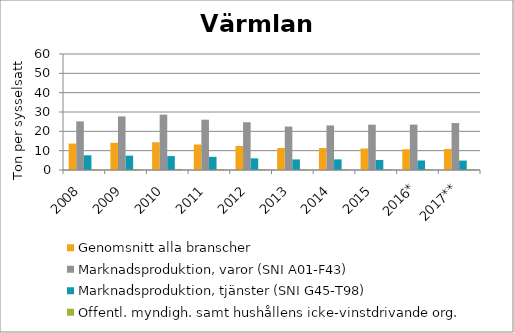
| Category | Genomsnitt alla branscher | Marknadsproduktion, varor (SNI A01-F43) | Marknadsproduktion, tjänster (SNI G45-T98) | Offentl. myndigh. samt hushållens icke-vinstdrivande org. |
|---|---|---|---|---|
| 2008 | 13.674 | 25.14 | 7.613 | 0.503 |
| 2009 | 14.056 | 27.711 | 7.437 | 0.516 |
| 2010 | 14.359 | 28.622 | 7.215 | 0.543 |
| 2011 | 13.195 | 26.022 | 6.811 | 0.502 |
| 2012 | 12.42 | 24.706 | 6.02 | 0.523 |
| 2013 | 11.37 | 22.475 | 5.469 | 0.47 |
| 2014 | 11.363 | 23.051 | 5.492 | 0.446 |
| 2015 | 11.111 | 23.458 | 5.205 | 0.423 |
| 2016* | 10.743 | 23.467 | 4.929 | 0.398 |
| 2017** | 10.894 | 24.287 | 4.883 | 0.385 |